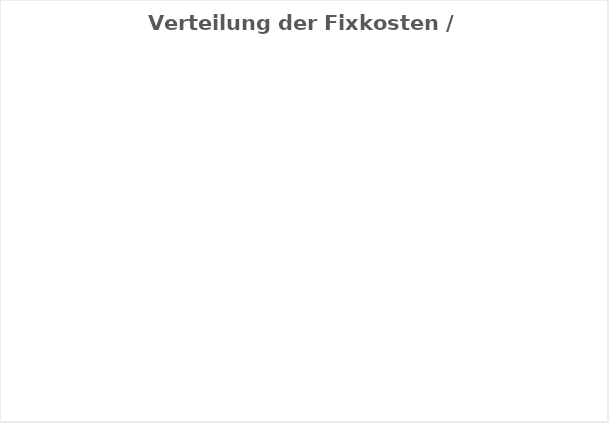
| Category | Series 1 |
|---|---|
| 0.0 | 0 |
| 0.0 | 0 |
| 0.0 | 0 |
| 0.0 | 0 |
| 0.0 | 0 |
| 0.0 | 0 |
| 0.0 | 0 |
| 0.0 | 0 |
| 0.0 | 0 |
| 0.0 | 0 |
| 0.0 | 0 |
| 0.0 | 0 |
| 0.0 | 0 |
| 0.0 | 0 |
| 0.0 | 0 |